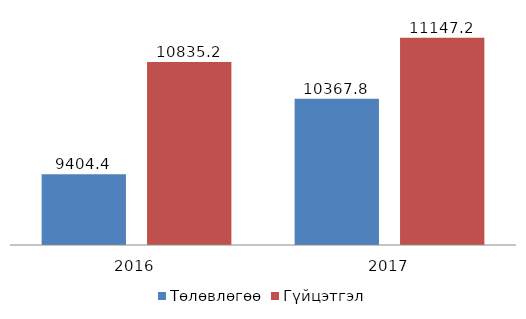
| Category | Төлөвлөгөө | Гүйцэтгэл |
|---|---|---|
| 2016.0 | 9404.4 | 10835.2 |
| 2017.0 | 10367.8 | 11147.2 |